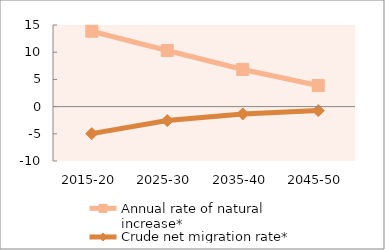
| Category | Annual rate of natural increase* | Crude net migration rate* |
|---|---|---|
| 2015-20 | 13.852 | -4.967 |
| 2025-30 | 10.31 | -2.567 |
| 2035-40 | 6.821 | -1.353 |
| 2045-50 | 3.87 | -0.727 |